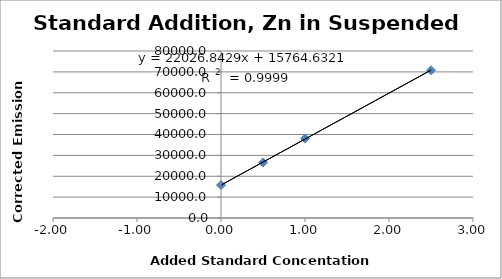
| Category | Series 0 |
|---|---|
| 0.0 | 15790.4 |
| 0.5 | 26554.2 |
| 1.0 | 38047 |
| 2.5 | 70774.3 |